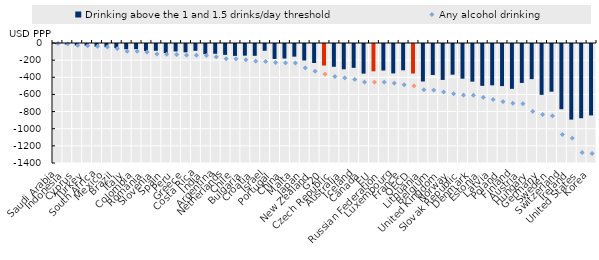
| Category | Drinking above the 1 and 1.5 drinks/day threshold |
|---|---|
| Saudi Arabia | -1.441 |
| Indonesia | -7.082 |
| Cyprus | -18.748 |
| Turkey | -22.816 |
| South Africa | -32.82 |
| Mexico | -36.607 |
| Brazil | -47.153 |
| Italy | -60.94 |
| Colombia | -60.021 |
| Romania | -81.197 |
| Slovenia | -78.978 |
| Spain | -104.725 |
| Peru | -86.793 |
| Greece | -97.26 |
| Costa Rica | -79.526 |
| India | -117.7 |
| Argentina | -113.897 |
| Netherlands | -126.873 |
| Chile | -138.924 |
| Bulgaria | -135.92 |
| Croatia | -137.929 |
| Israel | -79.034 |
| Portugal | -174.52 |
| China | -169.57 |
| Malta | -147.372 |
| Japan | -192.564 |
| New Zealand | -221.808 |
| G20 | -251.135 |
| Czech Republic | -265.633 |
| Australia | -295.343 |
| Iceland | -278.202 |
| Canada | -345.769 |
| EU | -318.676 |
| Russian Federation | -309.283 |
| Luxembourg | -343.133 |
| France | -306.682 |
| OECD | -343.985 |
| Lithuania | -437.519 |
| Belgium | -361.852 |
| United Kingdom | -419.138 |
| Norway | -358.171 |
| Slovak Republic | -404.689 |
| Denmark | -439.156 |
| Estonia | -488.281 |
| Latvia | -482.149 |
| Poland | -491.061 |
| Finland | -523.257 |
| Austria | -454.314 |
| Hungary | -410.04 |
| Germany | -593.191 |
| Sweden | -556.68 |
| Switzerland | -760.859 |
| Ireland | -882.144 |
| United States | -866.042 |
| Korea | -833.529 |